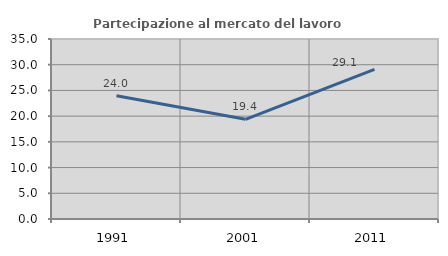
| Category | Partecipazione al mercato del lavoro  femminile |
|---|---|
| 1991.0 | 23.967 |
| 2001.0 | 19.378 |
| 2011.0 | 29.088 |